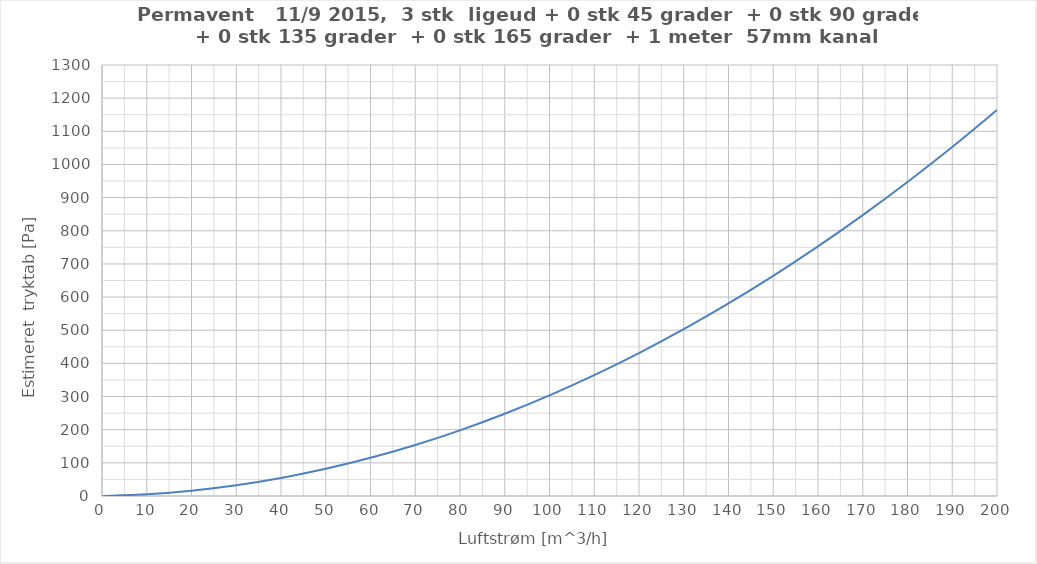
| Category | Series 0 |
|---|---|
| 0.0 | 0 |
| 10.0 | 5.255 |
| 20.0 | 16.083 |
| 30.0 | 32.485 |
| 40.0 | 54.46 |
| 50.0 | 82.009 |
| 60.0 | 115.132 |
| 70.0 | 153.827 |
| 80.0 | 198.097 |
| 90.0 | 247.94 |
| 100.0 | 303.356 |
| 110.0 | 364.346 |
| 120.0 | 430.909 |
| 130.0 | 503.046 |
| 140.0 | 580.756 |
| 150.0 | 664.04 |
| 160.0 | 752.897 |
| 170.0 | 847.328 |
| 180.0 | 947.332 |
| 190.0 | 1052.91 |
| 200.0 | 1164.061 |